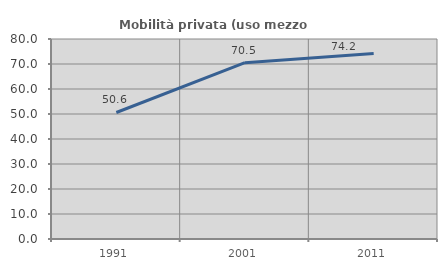
| Category | Mobilità privata (uso mezzo privato) |
|---|---|
| 1991.0 | 50.609 |
| 2001.0 | 70.534 |
| 2011.0 | 74.202 |